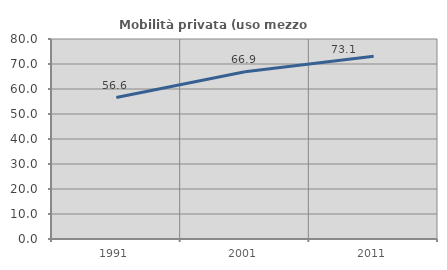
| Category | Mobilità privata (uso mezzo privato) |
|---|---|
| 1991.0 | 56.572 |
| 2001.0 | 66.896 |
| 2011.0 | 73.073 |